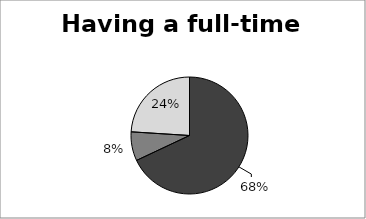
| Category | Having a full-time job |
|---|---|
| Share explained by the differences in disciplines (educational segregation) | 0.68 |
| Share explained by the differences in type of employer and sector of activity (professional segregation) | 0.08 |
| Share "not explained" by the model (socio-cultural segregation) | 0.24 |